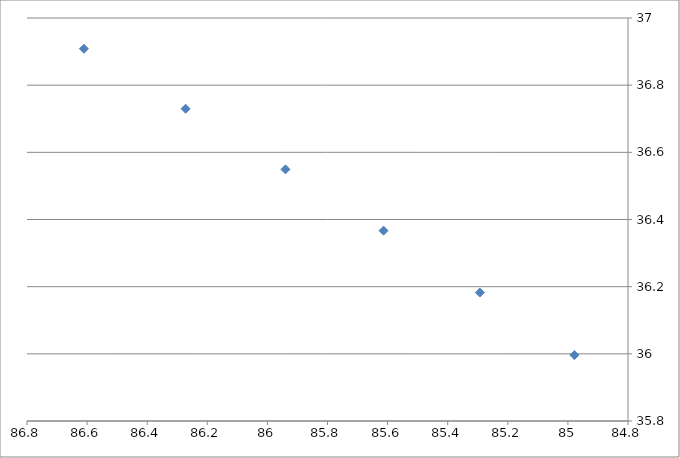
| Category | Series 0 |
|---|---|
| 86.61056499999995 | 36.908 |
| 86.27228444444427 | 36.73 |
| 85.9399294444438 | 36.549 |
| 85.61350000000039 | 36.367 |
| 85.29299611111128 | 36.182 |
| 84.97841777777785 | 35.996 |